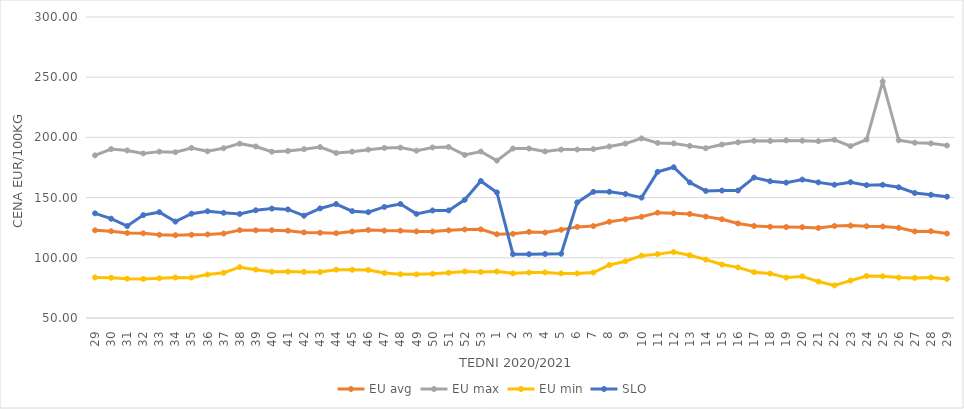
| Category | EU avg | EU max | EU min | SLO |
|---|---|---|---|---|
| 29.0 | 122.822 | 185.09 | 83.72 | 136.94 |
| 30.0 | 122.086 | 190.31 | 83.4 | 132.48 |
| 31.0 | 120.581 | 189.19 | 82.63 | 126.34 |
| 32.0 | 120.341 | 186.67 | 82.46 | 135.48 |
| 33.0 | 119.127 | 188.18 | 82.99 | 137.89 |
| 34.0 | 118.75 | 187.74 | 83.66 | 130.07 |
| 35.0 | 119.136 | 191.25 | 83.53 | 136.63 |
| 36.0 | 119.398 | 188.47 | 86.09 | 138.64 |
| 37.0 | 120.135 | 190.99 | 87.57 | 137.35 |
| 38.0 | 122.982 | 194.8 | 92.21 | 136.42 |
| 39.0 | 122.832 | 192.45 | 90.16 | 139.46 |
| 40.0 | 122.936 | 188.11 | 88.45 | 140.87 |
| 41.0 | 122.507 | 188.73 | 88.54 | 140.18 |
| 42.0 | 121.098 | 190.2 | 88.3 | 134.98 |
| 43.0 | 120.822 | 191.99 | 88.22 | 141 |
| 44.0 | 120.448 | 187.06 | 90.13 | 144.61 |
| 45.0 | 121.843 | 188.15 | 90.04 | 138.73 |
| 46.0 | 123.07 | 189.82 | 89.89 | 137.88 |
| 47.0 | 122.58 | 191.22 | 87.43 | 142.27 |
| 48.0 | 122.553 | 191.52 | 86.35 | 144.69 |
| 49.0 | 121.893 | 188.97 | 86.24 | 136.47 |
| 50.0 | 121.851 | 191.67 | 86.72 | 139.29 |
| 51.0 | 122.8 | 192.06 | 87.5 | 139.35 |
| 52.0 | 123.52 | 185.468 | 88.67 | 148.16 |
| 53.0 | 123.611 | 188.25 | 88.23 | 163.81 |
| 1.0 | 119.553 | 180.72 | 88.64 | 154.31 |
| 2.0 | 119.893 | 190.77 | 87.1 | 103.02 |
| 3.0 | 121.489 | 190.76 | 87.7 | 103.03 |
| 4.0 | 120.954 | 188.33 | 87.88 | 103.15 |
| 5.0 | 123.293 | 189.91 | 87.04 | 103.34 |
| 6.0 | 125.679 | 189.94 | 86.97 | 146.03 |
| 7.0 | 126.33 | 190.21 | 87.79 | 154.77 |
| 8.0 | 129.933 | 192.48 | 94.02 | 154.86 |
| 9.0 | 131.908 | 194.884 | 97.12 | 153 |
| 10.0 | 134.098 | 199.17 | 101.79 | 149.98 |
| 11.0 | 137.49 | 195.419 | 103.05 | 171.4 |
| 12.0 | 136.929 | 195.013 | 104.76 | 175.2 |
| 13.0 | 136.39 | 192.952 | 102.11 | 162.57 |
| 14.0 | 134.198 | 191.034 | 98.5 | 155.55 |
| 15.0 | 132.003 | 194.047 | 94.39 | 155.88 |
| 16.0 | 128.53 | 195.913 | 92.04 | 155.88 |
| 17.0 | 126.415 | 197.188 | 88.07 | 166.66 |
| 18.0 | 125.787 | 197.055 | 86.89 | 163.58 |
| 19.0 | 125.54 | 197.478 | 83.546 | 162.44 |
| 20.0 | 125.412 | 197.263 | 84.55 | 164.94 |
| 21.0 | 124.768 | 196.821 | 80.264 | 162.64 |
| 22.0 | 126.43 | 197.963 | 77.048 | 160.68 |
| 23.0 | 126.76 | 192.72 | 81.087 | 162.75 |
| 24.0 | 126.19 | 198.186 | 84.83 | 160.34 |
| 25.0 | 125.97 | 246.36 | 84.63 | 160.6 |
| 26.0 | 124.92 | 197.607 | 83.57 | 158.57 |
| 27.0 | 121.922 | 195.566 | 83.3 | 153.83 |
| 28.0 | 122.106 | 195.043 | 83.64 | 152.35 |
| 29.0 | 120.145 | 193.272 | 82.49 | 150.79 |